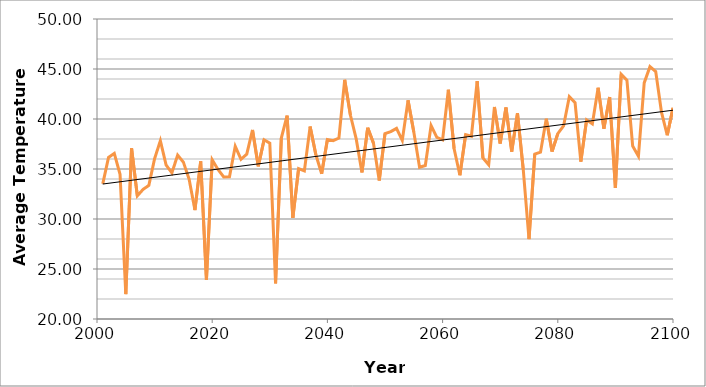
| Category | A2 |
|---|---|
| 2001.0 | 33.514 |
| 2002.0 | 36.16 |
| 2003.0 | 36.561 |
| 2004.0 | 34.464 |
| 2005.0 | 22.487 |
| 2006.0 | 37.081 |
| 2007.0 | 32.317 |
| 2008.0 | 32.961 |
| 2009.0 | 33.359 |
| 2010.0 | 36.036 |
| 2011.0 | 37.827 |
| 2012.0 | 35.393 |
| 2013.0 | 34.61 |
| 2014.0 | 36.388 |
| 2015.0 | 35.681 |
| 2016.0 | 33.955 |
| 2017.0 | 30.891 |
| 2018.0 | 35.76 |
| 2019.0 | 23.896 |
| 2020.0 | 35.926 |
| 2021.0 | 34.952 |
| 2022.0 | 34.2 |
| 2023.0 | 34.221 |
| 2024.0 | 37.272 |
| 2025.0 | 35.969 |
| 2026.0 | 36.487 |
| 2027.0 | 38.908 |
| 2028.0 | 35.265 |
| 2029.0 | 37.918 |
| 2030.0 | 37.576 |
| 2031.0 | 23.563 |
| 2032.0 | 38.097 |
| 2033.0 | 40.341 |
| 2034.0 | 30.11 |
| 2035.0 | 35.029 |
| 2036.0 | 34.799 |
| 2037.0 | 39.243 |
| 2038.0 | 36.423 |
| 2039.0 | 34.529 |
| 2040.0 | 37.944 |
| 2041.0 | 37.828 |
| 2042.0 | 38.095 |
| 2043.0 | 43.921 |
| 2044.0 | 40.374 |
| 2045.0 | 38.01 |
| 2046.0 | 34.66 |
| 2047.0 | 39.121 |
| 2048.0 | 37.584 |
| 2049.0 | 33.85 |
| 2050.0 | 38.536 |
| 2051.0 | 38.739 |
| 2052.0 | 39.065 |
| 2053.0 | 37.864 |
| 2054.0 | 41.866 |
| 2055.0 | 38.691 |
| 2056.0 | 35.175 |
| 2057.0 | 35.35 |
| 2058.0 | 39.335 |
| 2059.0 | 38.156 |
| 2060.0 | 37.915 |
| 2061.0 | 42.924 |
| 2062.0 | 37.026 |
| 2063.0 | 34.378 |
| 2064.0 | 38.442 |
| 2065.0 | 38.278 |
| 2066.0 | 43.794 |
| 2067.0 | 36.106 |
| 2068.0 | 35.425 |
| 2069.0 | 41.2 |
| 2070.0 | 37.558 |
| 2071.0 | 41.157 |
| 2072.0 | 36.738 |
| 2073.0 | 40.588 |
| 2074.0 | 34.963 |
| 2075.0 | 27.991 |
| 2076.0 | 36.495 |
| 2077.0 | 36.685 |
| 2078.0 | 40.03 |
| 2079.0 | 36.745 |
| 2080.0 | 38.529 |
| 2081.0 | 39.301 |
| 2082.0 | 42.235 |
| 2083.0 | 41.626 |
| 2084.0 | 35.735 |
| 2085.0 | 39.916 |
| 2086.0 | 39.51 |
| 2087.0 | 43.129 |
| 2088.0 | 39.034 |
| 2089.0 | 42.199 |
| 2090.0 | 33.1 |
| 2091.0 | 44.478 |
| 2092.0 | 43.893 |
| 2093.0 | 37.292 |
| 2094.0 | 36.282 |
| 2095.0 | 43.61 |
| 2096.0 | 45.237 |
| 2097.0 | 44.751 |
| 2098.0 | 40.687 |
| 2099.0 | 38.374 |
| 2100.0 | 41.113 |